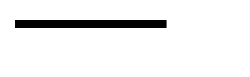
| Category | Series 0 |
|---|---|
| 0 | 1.072 |